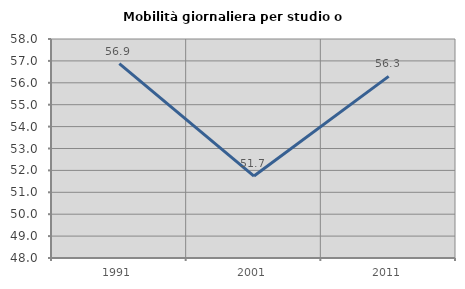
| Category | Mobilità giornaliera per studio o lavoro |
|---|---|
| 1991.0 | 56.879 |
| 2001.0 | 51.742 |
| 2011.0 | 56.295 |